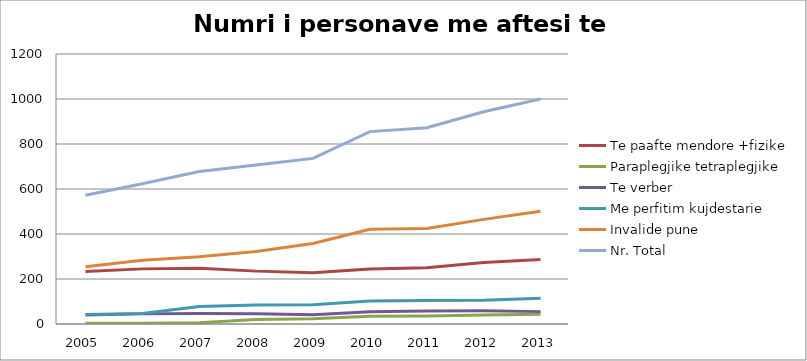
| Category | Te paafte mendore +fizike | Paraplegjike tetraplegjike | Te verber | Me perfitim kujdestarie | Invalide pune | Nr. Total |
|---|---|---|---|---|---|---|
| 2005.0 | 233 | 3 | 40 | 42 | 254 | 572 |
| 2006.0 | 245 | 3 | 45 | 47 | 283 | 623 |
| 2007.0 | 248 | 6 | 47 | 78 | 299 | 678 |
| 2008.0 | 235 | 20 | 46 | 84 | 322 | 707 |
| 2009.0 | 228 | 23 | 41 | 86 | 358 | 736 |
| 2010.0 | 244 | 34 | 54 | 102 | 421 | 855 |
| 2011.0 | 250 | 36 | 58 | 104 | 424 | 872 |
| 2012.0 | 273 | 40 | 59 | 106 | 465 | 943 |
| 2013.0 | 287 | 43 | 55 | 114 | 501 | 1000 |